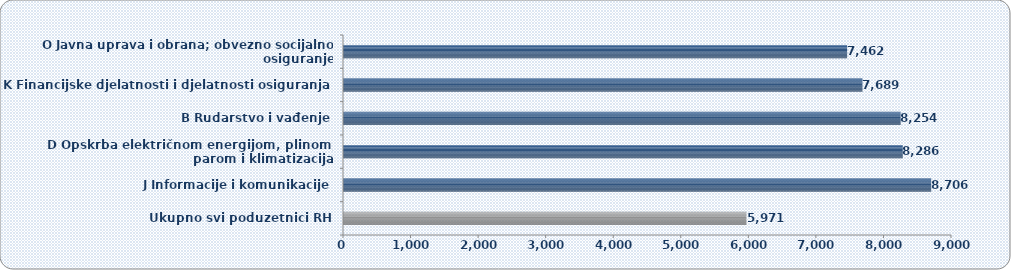
| Category | Prosječna mjesečna neto plaća  |
|---|---|
| Ukupno svi poduzetnici RH | 5970.837 |
| J Informacije i komunikacije | 8705.748 |
| D Opskrba električnom energijom, plinom, parom i klimatizacija | 8285.585 |
| B Rudarstvo i vađenje | 8254.143 |
| K Financijske djelatnosti i djelatnosti osiguranja | 7688.889 |
| O Javna uprava i obrana; obvezno socijalno osiguranje | 7462.289 |